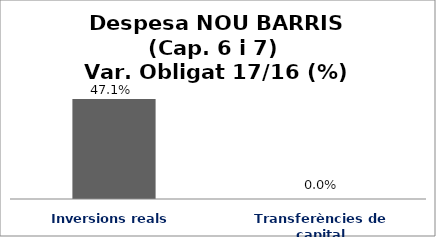
| Category | Series 0 |
|---|---|
| Inversions reals | 0.471 |
| Transferències de capital | 0 |